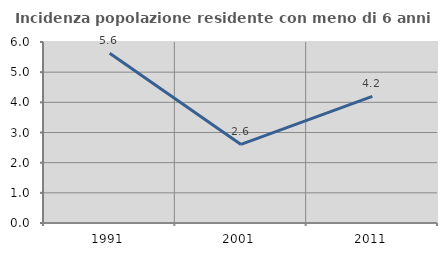
| Category | Incidenza popolazione residente con meno di 6 anni |
|---|---|
| 1991.0 | 5.627 |
| 2001.0 | 2.604 |
| 2011.0 | 4.198 |